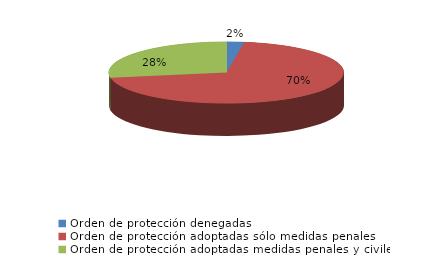
| Category | Series 0 |
|---|---|
| Orden de protección denegadas | 4 |
| Orden de protección adoptadas sólo medidas penales | 116 |
| Orden de protección adoptadas medidas penales y civiles | 46 |